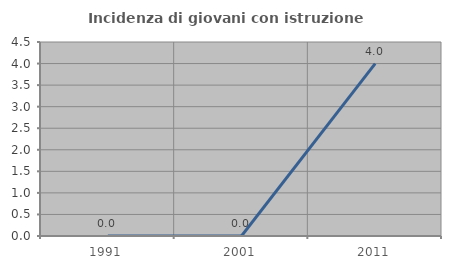
| Category | Incidenza di giovani con istruzione universitaria |
|---|---|
| 1991.0 | 0 |
| 2001.0 | 0 |
| 2011.0 | 4 |